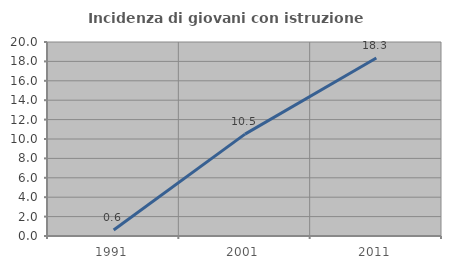
| Category | Incidenza di giovani con istruzione universitaria |
|---|---|
| 1991.0 | 0.623 |
| 2001.0 | 10.5 |
| 2011.0 | 18.349 |